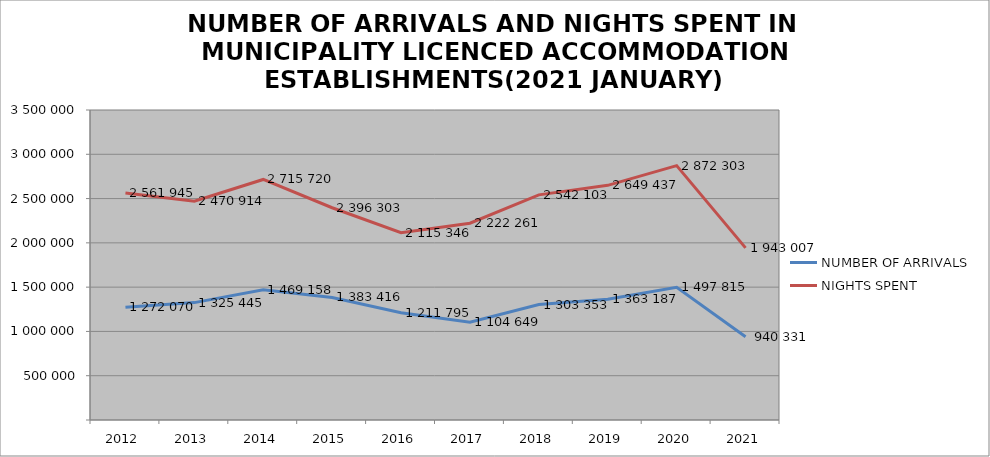
| Category | NUMBER OF ARRIVALS | NIGHTS SPENT |
|---|---|---|
| 2012 | 1272070 | 2561945 |
| 2013 | 1325445 | 2470914 |
| 2014 | 1469158 | 2715720 |
| 2015 | 1383416 | 2396303 |
| 2016 | 1211795 | 2115346 |
| 2017 | 1104649 | 2222261 |
| 2018 | 1303353 | 2542103 |
| 2019 | 1363187 | 2649437 |
| 2020 | 1497815 | 2872303 |
| 2021 | 940331 | 1943007 |